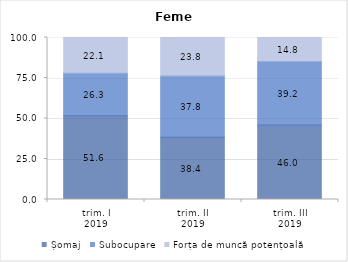
| Category | Șomaj | Subocupare | Forța de muncă potențoală |
|---|---|---|---|
| trim. I
2019 | 51.65 | 26.255 | 22.095 |
| trim. II
2019 | 38.443 | 37.796 | 23.76 |
| trim. III
2019 | 46.007 | 39.205 | 14.788 |